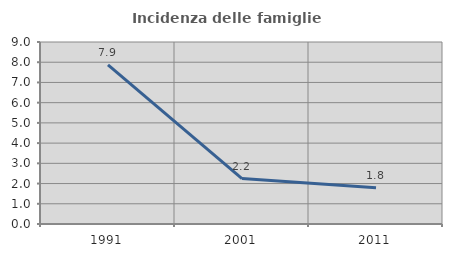
| Category | Incidenza delle famiglie numerose |
|---|---|
| 1991.0 | 7.865 |
| 2001.0 | 2.247 |
| 2011.0 | 1.796 |